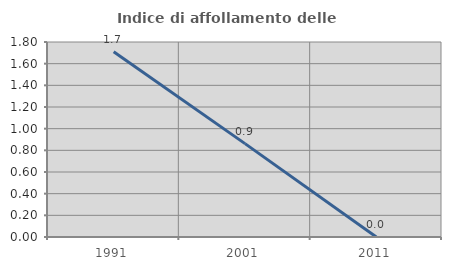
| Category | Indice di affollamento delle abitazioni  |
|---|---|
| 1991.0 | 1.709 |
| 2001.0 | 0.862 |
| 2011.0 | 0 |